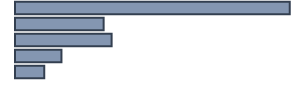
| Category | Series 0 |
|---|---|
| 0 | 96.4 |
| 1 | 31.1 |
| 2 | 33.9 |
| 3 | 16.3 |
| 4 | 10.3 |